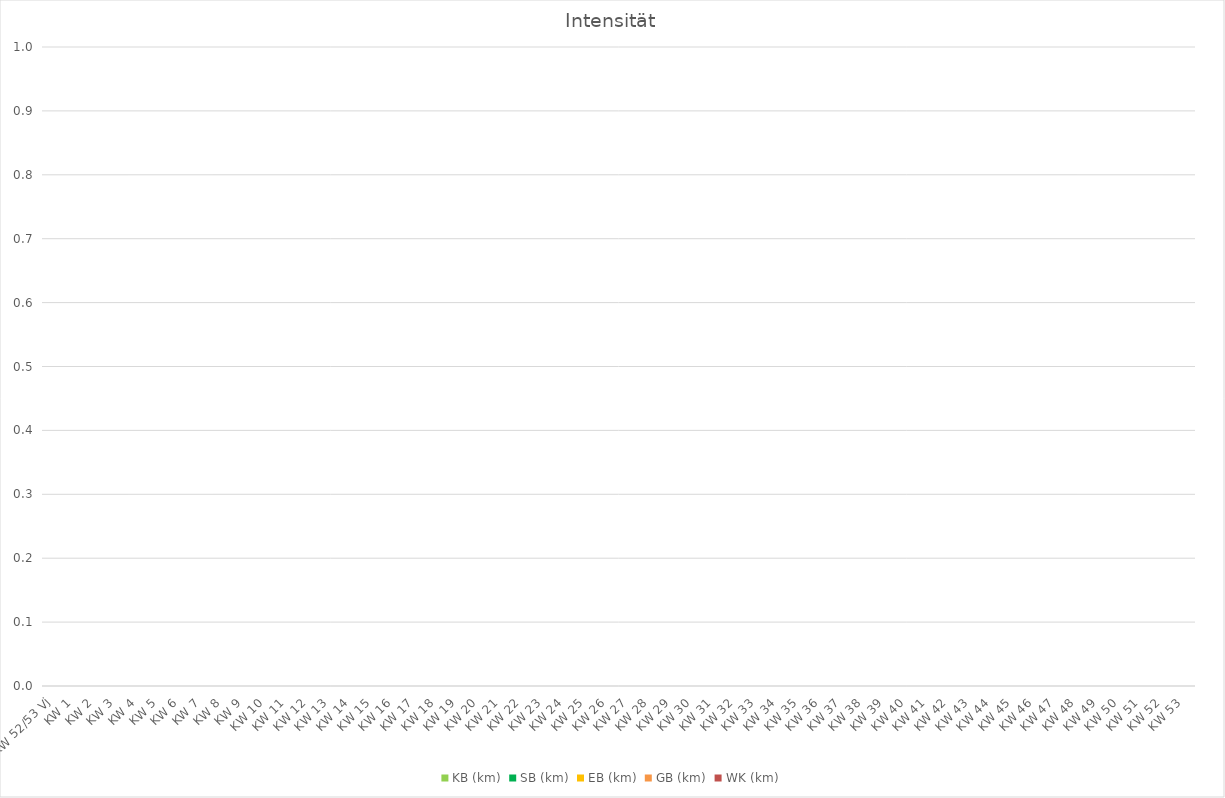
| Category | KB (km) | SB (km) | EB (km) | GB (km) | WK (km) |
|---|---|---|---|---|---|
| KW 52/53 Vj | 0 | 0 | 0 | 0 | 0 |
| KW 1 | 0 | 0 | 0 | 0 | 0 |
| KW 2 | 0 | 0 | 0 | 0 | 0 |
| KW 3 | 0 | 0 | 0 | 0 | 0 |
| KW 4 | 0 | 0 | 0 | 0 | 0 |
| KW 5 | 0 | 0 | 0 | 0 | 0 |
| KW 6 | 0 | 0 | 0 | 0 | 0 |
| KW 7 | 0 | 0 | 0 | 0 | 0 |
| KW 8 | 0 | 0 | 0 | 0 | 0 |
| KW 9 | 0 | 0 | 0 | 0 | 0 |
| KW 10 | 0 | 0 | 0 | 0 | 0 |
| KW 11 | 0 | 0 | 0 | 0 | 0 |
| KW 12 | 0 | 0 | 0 | 0 | 0 |
| KW 13 | 0 | 0 | 0 | 0 | 0 |
| KW 14 | 0 | 0 | 0 | 0 | 0 |
| KW 15 | 0 | 0 | 0 | 0 | 0 |
| KW 16 | 0 | 0 | 0 | 0 | 0 |
| KW 17 | 0 | 0 | 0 | 0 | 0 |
| KW 18 | 0 | 0 | 0 | 0 | 0 |
| KW 19 | 0 | 0 | 0 | 0 | 0 |
| KW 20 | 0 | 0 | 0 | 0 | 0 |
| KW 21 | 0 | 0 | 0 | 0 | 0 |
| KW 22 | 0 | 0 | 0 | 0 | 0 |
| KW 23 | 0 | 0 | 0 | 0 | 0 |
| KW 24 | 0 | 0 | 0 | 0 | 0 |
| KW 25 | 0 | 0 | 0 | 0 | 0 |
| KW 26 | 0 | 0 | 0 | 0 | 0 |
| KW 27 | 0 | 0 | 0 | 0 | 0 |
| KW 28 | 0 | 0 | 0 | 0 | 0 |
| KW 29 | 0 | 0 | 0 | 0 | 0 |
| KW 30 | 0 | 0 | 0 | 0 | 0 |
| KW 31 | 0 | 0 | 0 | 0 | 0 |
| KW 32 | 0 | 0 | 0 | 0 | 0 |
| KW 33 | 0 | 0 | 0 | 0 | 0 |
| KW 34 | 0 | 0 | 0 | 0 | 0 |
| KW 35 | 0 | 0 | 0 | 0 | 0 |
| KW 36 | 0 | 0 | 0 | 0 | 0 |
| KW 37 | 0 | 0 | 0 | 0 | 0 |
| KW 38 | 0 | 0 | 0 | 0 | 0 |
| KW 39 | 0 | 0 | 0 | 0 | 0 |
| KW 40 | 0 | 0 | 0 | 0 | 0 |
| KW 41 | 0 | 0 | 0 | 0 | 0 |
| KW 42 | 0 | 0 | 0 | 0 | 0 |
| KW 43 | 0 | 0 | 0 | 0 | 0 |
| KW 44 | 0 | 0 | 0 | 0 | 0 |
| KW 45 | 0 | 0 | 0 | 0 | 0 |
| KW 46 | 0 | 0 | 0 | 0 | 0 |
| KW 47 | 0 | 0 | 0 | 0 | 0 |
| KW 48 | 0 | 0 | 0 | 0 | 0 |
| KW 49 | 0 | 0 | 0 | 0 | 0 |
| KW 50 | 0 | 0 | 0 | 0 | 0 |
| KW 51 | 0 | 0 | 0 | 0 | 0 |
| KW 52 | 0 | 0 | 0 | 0 | 0 |
| KW 53 | 0 | 0 | 0 | 0 | 0 |